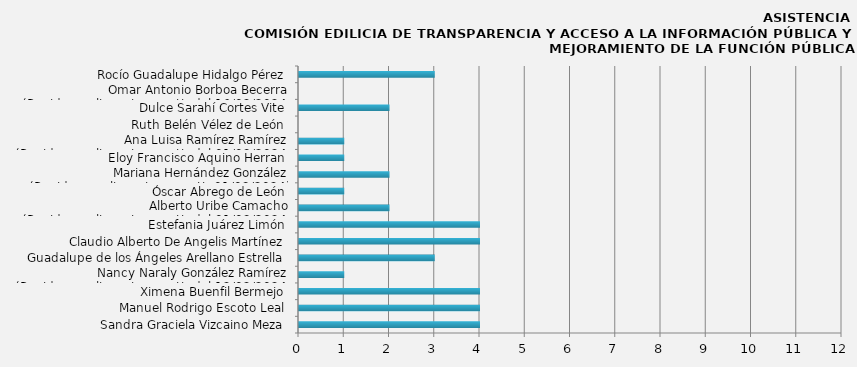
| Category | Sandra Graciela Vizcaino Meza |
|---|---|
| Sandra Graciela Vizcaino Meza | 4 |
| Manuel Rodrigo Escoto Leal | 4 |
| Ximena Buenfil Bermejo | 4 |
| Nancy Naraly González Ramírez
(Regidora en licencia a partir del 12/02/2024) | 1 |
| Guadalupe de los Ángeles Arellano Estrella | 3 |
| Claudio Alberto De Angelis Martínez | 4 |
| Estefania Juárez Limón | 4 |
| Alberto Uribe Camacho
(Regidor en licencia a partir del 01/03/2024) | 2 |
| Óscar Abrego de León | 1 |
| Mariana Hernández González
(Regidora en licencia a apartir 01/03/2024) | 2 |
| Eloy Francisco Aquino Herran | 1 |
| Ana Luisa Ramírez Ramírez
(Regidora en licencia a partir del 01/03/2024) | 1 |
| Ruth Belén Vélez de León | 0 |
| Dulce Sarahí Cortes Vite | 2 |
| Omar Antonio Borboa Becerra
(Regidor en licencia a partir del 16/02/2024) | 0 |
| Rocío Guadalupe Hidalgo Pérez | 3 |